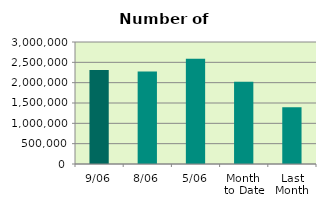
| Category | Series 0 |
|---|---|
| 9/06 | 2309812 |
| 8/06 | 2271600 |
| 5/06 | 2585524 |
| Month 
to Date | 2021092.857 |
| Last
Month | 1395416 |